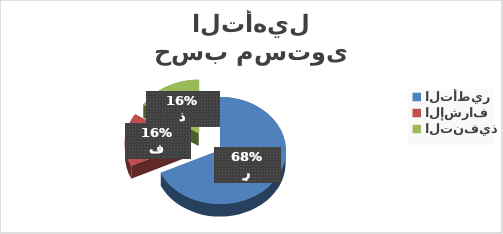
| Category | إناث |
|---|---|
| التأطير | 51 |
| الإشراف | 12 |
| التنفيذ | 12 |